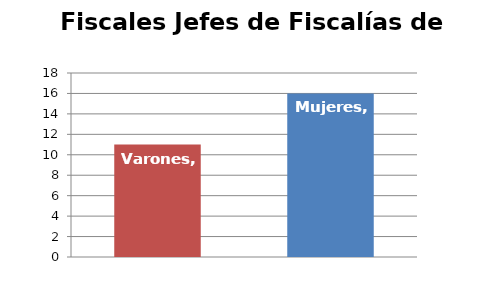
| Category | Fiscales Jefes de Fiscalías de Área  |
|---|---|
| Varones | 11 |
| Mujeres | 16 |